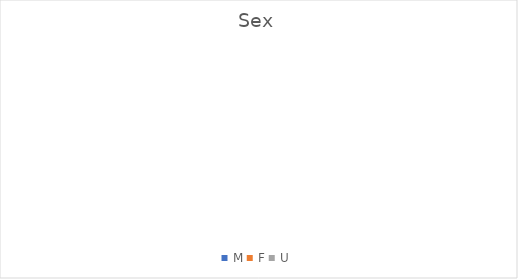
| Category | Sightings |
|---|---|
| M | 0 |
| F | 0 |
| U | 0 |